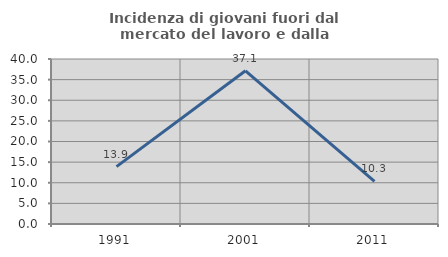
| Category | Incidenza di giovani fuori dal mercato del lavoro e dalla formazione  |
|---|---|
| 1991.0 | 13.913 |
| 2001.0 | 37.143 |
| 2011.0 | 10.345 |